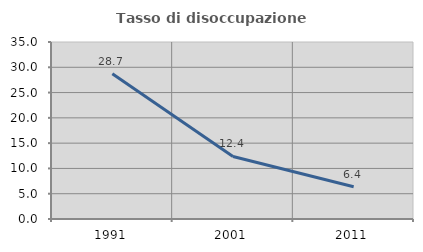
| Category | Tasso di disoccupazione giovanile  |
|---|---|
| 1991.0 | 28.736 |
| 2001.0 | 12.36 |
| 2011.0 | 6.383 |